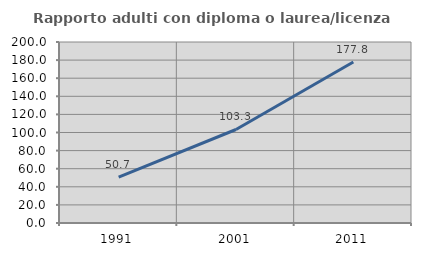
| Category | Rapporto adulti con diploma o laurea/licenza media  |
|---|---|
| 1991.0 | 50.711 |
| 2001.0 | 103.32 |
| 2011.0 | 177.835 |